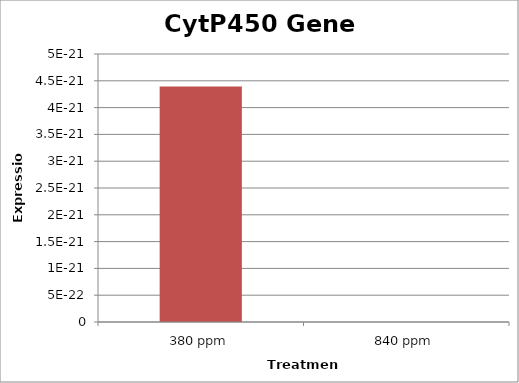
| Category | Series 0 |
|---|---|
| 380 ppm | 0 |
| 840 ppm | 0 |